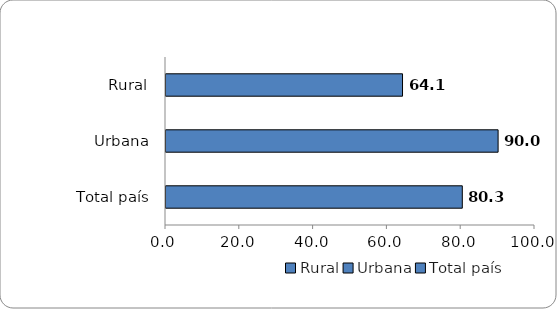
| Category | 2016 |
|---|---|
| Rural | 64.1 |
| Urbana | 90 |
| Total país | 80.3 |